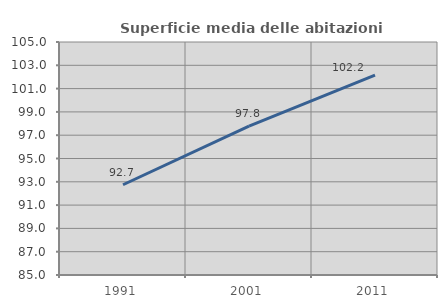
| Category | Superficie media delle abitazioni occupate |
|---|---|
| 1991.0 | 92.747 |
| 2001.0 | 97.785 |
| 2011.0 | 102.16 |